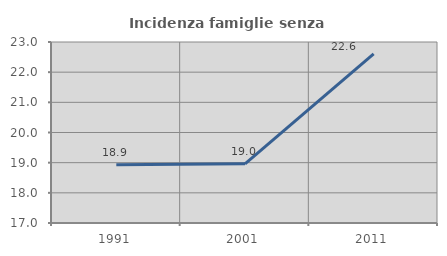
| Category | Incidenza famiglie senza nuclei |
|---|---|
| 1991.0 | 18.934 |
| 2001.0 | 18.961 |
| 2011.0 | 22.607 |